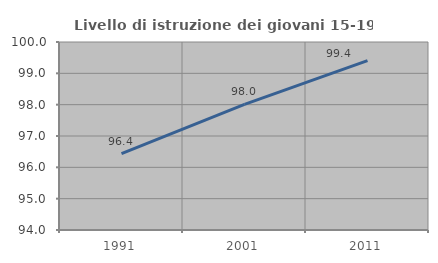
| Category | Livello di istruzione dei giovani 15-19 anni |
|---|---|
| 1991.0 | 96.438 |
| 2001.0 | 98.008 |
| 2011.0 | 99.408 |